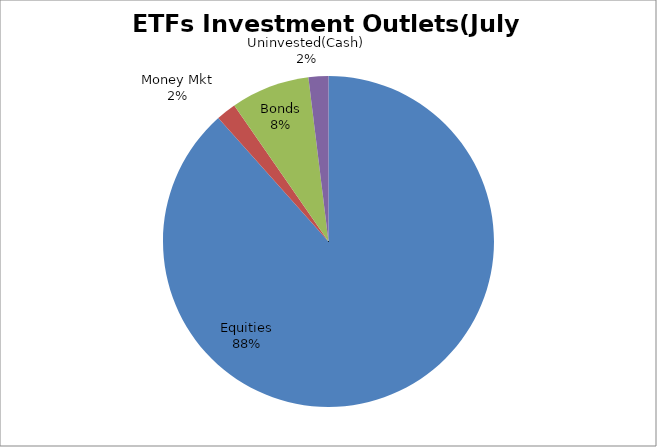
| Category | Series 0 |
|---|---|
| Equities | 5450573222.74 |
| Money Mkt | 120602888.23 |
| Bonds | 474827704.85 |
| Uninvested(Cash) | 119719492.83 |